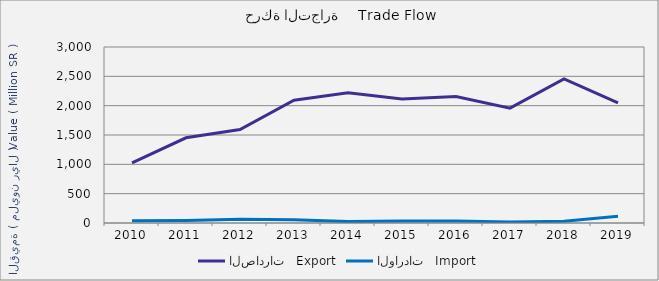
| Category | الصادرات   Export | الواردات   Import |
|---|---|---|
| 2010.0 | 1023712559 | 37371777 |
| 2011.0 | 1452707446 | 44678460 |
| 2012.0 | 1594041365 | 64801981 |
| 2013.0 | 2093150287 | 57184013 |
| 2014.0 | 2220645530 | 23755453 |
| 2015.0 | 2113694029 | 33076585 |
| 2016.0 | 2157029246 | 35941439 |
| 2017.0 | 1958394053 | 17870326 |
| 2018.0 | 2455152349 | 29106109 |
| 2019.0 | 2046693366 | 117038354 |